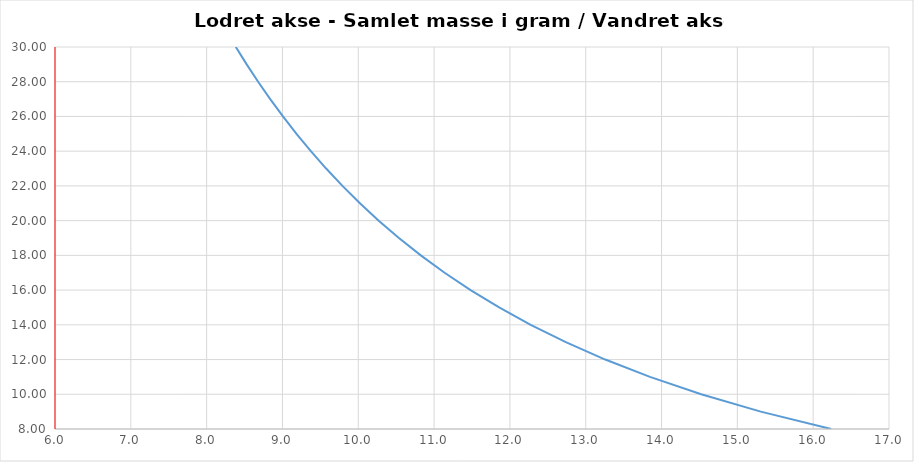
| Category | Samlet masse |
|---|---|
| 16.237148654228584 | 8 |
| 15.308530560718738 | 9 |
| 14.522947260649737 | 10 |
| 13.847086898616277 | 11 |
| 13.257576360192866 | 12 |
| 12.737467358925903 | 13 |
| 12.274130668535978 | 14 |
| 11.857936783314194 | 15 |
| 11.481397920539056 | 16 |
| 11.138592083795174 | 17 |
| 10.824765769485722 | 18 |
| 10.536053319201637 | 19 |
| 10.269274490820022 | 20 |
| 10.02178572471977 | 21 |
| 9.79136904569097 | 22 |
| 9.57614783982927 | 23 |
| 9.374522146390843 | 24 |
| 9.185118336431243 | 25 |
| 9.00674954463881 | 26 |
| 8.838384240128578 | 27 |
| 8.679121028891563 | 28 |
| 8.5281682783992 | 29 |
| 8.384827510362863 | 30 |